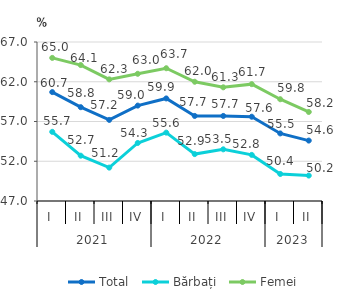
| Category | Total | Bărbați | Femei |
|---|---|---|---|
| 0 | 60.7 | 55.7 | 65 |
| 1 | 58.8 | 52.7 | 64.1 |
| 2 | 57.2 | 51.2 | 62.3 |
| 3 | 59 | 54.3 | 63 |
| 4 | 59.9 | 55.6 | 63.7 |
| 5 | 57.7 | 52.9 | 62 |
| 6 | 57.7 | 53.5 | 61.3 |
| 7 | 57.6 | 52.8 | 61.7 |
| 8 | 55.5 | 50.4 | 59.8 |
| 9 | 54.6 | 50.2 | 58.2 |